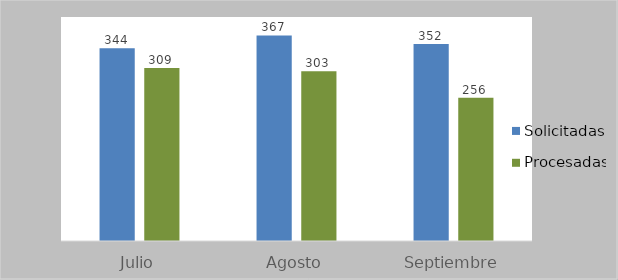
| Category | Solicitadas | Procesadas |
|---|---|---|
| Julio | 344 | 309 |
| Agosto | 367 | 303 |
| Septiembre | 352 | 256 |